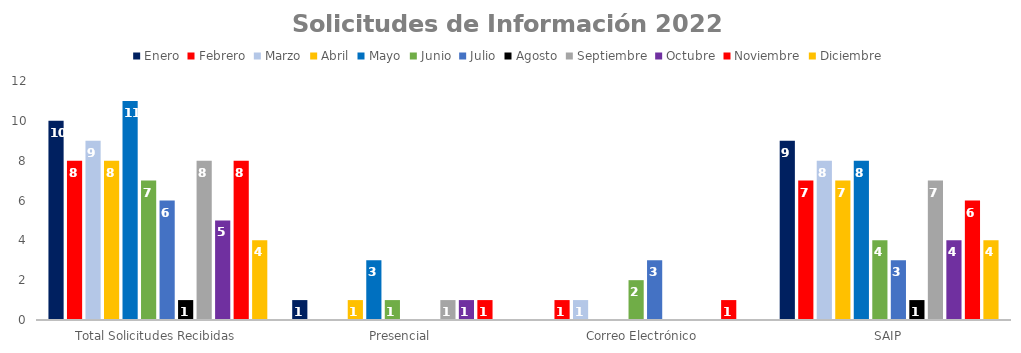
| Category | Enero | Febrero | Marzo | Abril | Mayo | Junio | Julio | Agosto | Septiembre | Octubre | Noviembre | Diciembre |
|---|---|---|---|---|---|---|---|---|---|---|---|---|
| Total Solicitudes Recibidas | 10 | 8 | 9 | 8 | 11 | 7 | 6 | 1 | 8 | 5 | 8 | 4 |
| Presencial | 1 | 0 | 0 | 1 | 3 | 1 | 0 | 0 | 1 | 1 | 1 | 0 |
| Correo Electrónico  | 0 | 1 | 1 | 0 | 0 | 2 | 3 | 0 | 0 | 0 | 1 | 0 |
| SAIP | 9 | 7 | 8 | 7 | 8 | 4 | 3 | 1 | 7 | 4 | 6 | 4 |